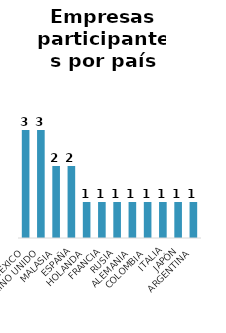
| Category | Empresas participantes por país |
|---|---|
| MÉXICO | 3 |
| REINO UNIDO | 3 |
| MALASIA | 2 |
| ESPAÑA | 2 |
| HOLANDA | 1 |
| FRANCIA | 1 |
| RUSIA | 1 |
| ALEMANIA | 1 |
| COLOMBIA | 1 |
| ITALIA | 1 |
| JAPÓN | 1 |
| ARGENTINA | 1 |